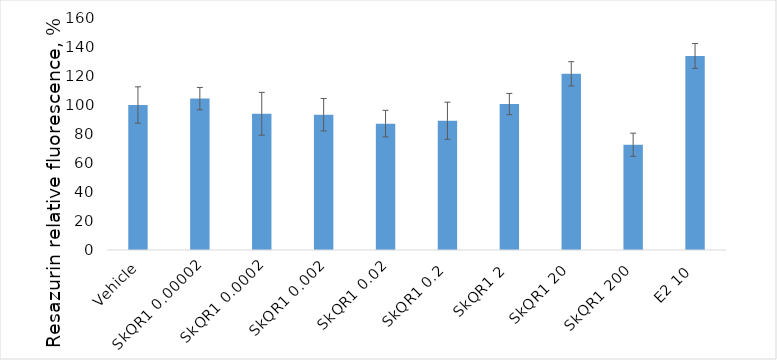
| Category | Series 0 |
|---|---|
| Vehicle | 100 |
| SkQR1 0.00002 | 104.399 |
| SkQR1 0.0002 | 93.943 |
| SkQR1 0.002 | 93.316 |
| SkQR1 0.02 | 87.147 |
| SkQR1 0.2 | 89.134 |
| SkQR1 2 | 100.635 |
| SkQR1 20 | 121.494 |
| SkQR1 200 | 72.614 |
| E2 10 | 133.831 |